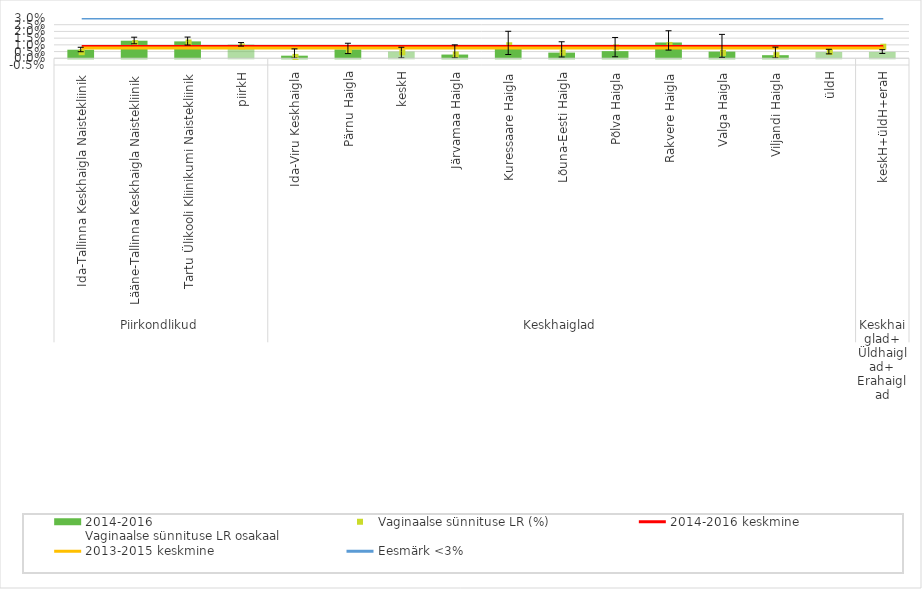
| Category | 2014-2016 
Vaginaalse sünnituse LR osakaal |
|---|---|
| 0 | 0.006 |
| 1 | 0.013 |
| 2 | 0.013 |
| 3 | 0.01 |
| 4 | 0.002 |
| 5 | 0.007 |
| 6 | 0.005 |
| 7 | 0.003 |
| 8 | 0.009 |
| 9 | 0.004 |
| 10 | 0.005 |
| 11 | 0.012 |
| 12 | 0.005 |
| 13 | 0.002 |
| 14 | 0.005 |
| 15 | 0.005 |